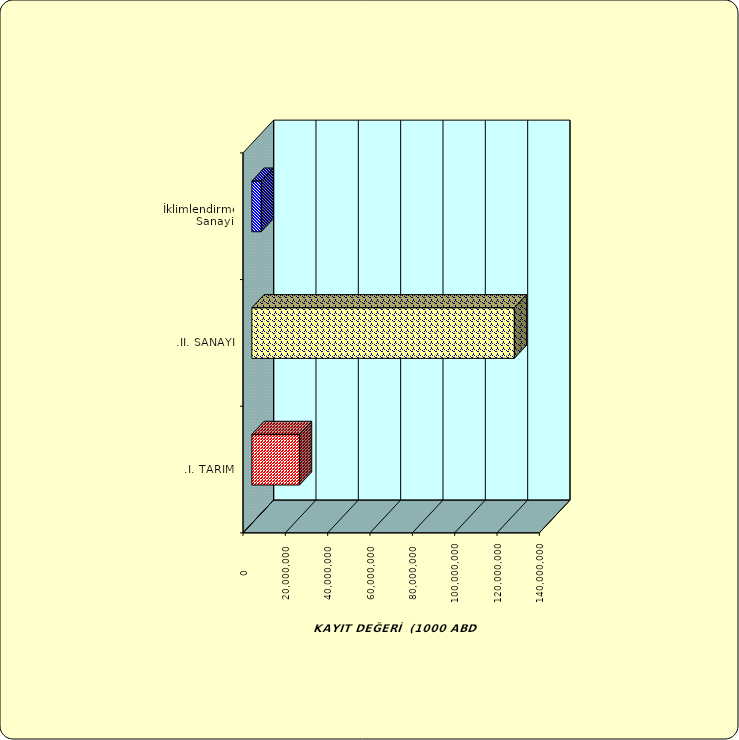
| Category | Series 0 |
|---|---|
| .I. TARIM | 22477147.269 |
| .II. SANAYİ | 123991110.902 |
|  İklimlendirme Sanayii | 4422788.666 |